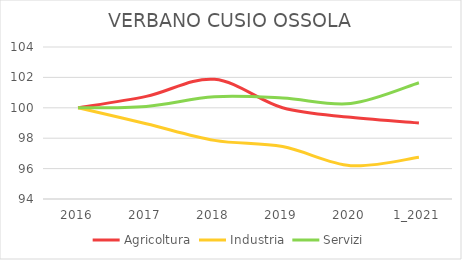
| Category | Agricoltura | Industria | Servizi |
|---|---|---|---|
| 2016 | 100 | 100 | 100 |
| 2017 | 100.75 | 98.952 | 100.091 |
| 2018 | 101.875 | 97.858 | 100.729 |
| 2019 | 100 | 97.448 | 100.648 |
| 2020 | 99.375 | 96.194 | 100.284 |
| 1_2021 | 99 | 96.741 | 101.651 |